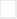
| Category | Monto |
|---|---|
| MARZO | 349.22 |
| ABRIL | 351.44 |
| MAYO | 106.23 |
| JUNIO | 105.59 |
| JULIO | 140.96 |
| AGOSTO | 250 |
| SEPTIEMBRE | 245.18 |
| OCTUBRE | 205.15 |
| NOVIEMBRE | 72.12 |
| DICIEMBRE | 115.04 |